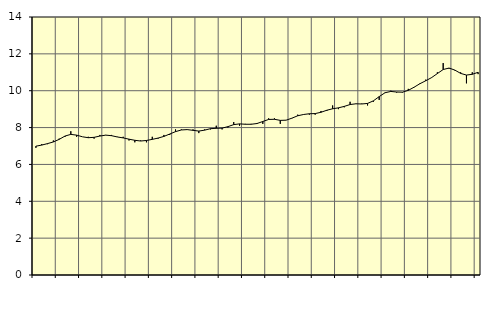
| Category | Piggar | Offentlig förvaltning m.m., SNI 84, 99 |
|---|---|---|
| nan | 6.9 | 6.99 |
| 1.0 | 7.1 | 7.05 |
| 1.0 | 7.1 | 7.13 |
| 1.0 | 7.3 | 7.22 |
| nan | 7.4 | 7.36 |
| 2.0 | 7.5 | 7.54 |
| 2.0 | 7.8 | 7.63 |
| 2.0 | 7.5 | 7.59 |
| nan | 7.5 | 7.5 |
| 3.0 | 7.5 | 7.45 |
| 3.0 | 7.4 | 7.47 |
| 3.0 | 7.6 | 7.54 |
| nan | 7.6 | 7.59 |
| 4.0 | 7.6 | 7.56 |
| 4.0 | 7.5 | 7.49 |
| 4.0 | 7.5 | 7.44 |
| nan | 7.3 | 7.37 |
| 5.0 | 7.2 | 7.31 |
| 5.0 | 7.3 | 7.27 |
| 5.0 | 7.2 | 7.3 |
| nan | 7.5 | 7.36 |
| 6.0 | 7.4 | 7.43 |
| 6.0 | 7.6 | 7.52 |
| 6.0 | 7.6 | 7.65 |
| nan | 7.9 | 7.78 |
| 7.0 | 7.9 | 7.87 |
| 7.0 | 7.9 | 7.89 |
| 7.0 | 7.9 | 7.85 |
| nan | 7.7 | 7.81 |
| 8.0 | 7.9 | 7.86 |
| 8.0 | 7.9 | 7.94 |
| 8.0 | 8.1 | 7.96 |
| nan | 7.9 | 7.97 |
| 9.0 | 8 | 8.05 |
| 9.0 | 8.3 | 8.16 |
| 9.0 | 8.1 | 8.2 |
| nan | 8.2 | 8.18 |
| 10.0 | 8.2 | 8.18 |
| 10.0 | 8.2 | 8.22 |
| 10.0 | 8.2 | 8.33 |
| nan | 8.5 | 8.44 |
| 11.0 | 8.5 | 8.45 |
| 11.0 | 8.2 | 8.39 |
| 11.0 | 8.4 | 8.4 |
| nan | 8.5 | 8.51 |
| 12.0 | 8.7 | 8.64 |
| 12.0 | 8.7 | 8.71 |
| 12.0 | 8.7 | 8.75 |
| nan | 8.7 | 8.76 |
| 13.0 | 8.9 | 8.83 |
| 13.0 | 8.9 | 8.94 |
| 13.0 | 9.2 | 9.02 |
| nan | 9 | 9.07 |
| 14.0 | 9.1 | 9.15 |
| 14.0 | 9.4 | 9.25 |
| 14.0 | 9.3 | 9.29 |
| nan | 9.3 | 9.28 |
| 15.0 | 9.2 | 9.31 |
| 15.0 | 9.4 | 9.45 |
| 15.0 | 9.5 | 9.68 |
| nan | 9.9 | 9.89 |
| 16.0 | 10 | 9.96 |
| 16.0 | 9.9 | 9.93 |
| 16.0 | 9.9 | 9.92 |
| nan | 10.1 | 10.02 |
| 17.0 | 10.2 | 10.19 |
| 17.0 | 10.4 | 10.38 |
| 17.0 | 10.6 | 10.54 |
| nan | 10.7 | 10.71 |
| 18.0 | 11 | 10.93 |
| 18.0 | 11.5 | 11.15 |
| 18.0 | 11.2 | 11.23 |
| nan | 11.1 | 11.12 |
| 19.0 | 11 | 10.94 |
| 19.0 | 10.4 | 10.85 |
| 19.0 | 11 | 10.89 |
| nan | 10.9 | 11 |